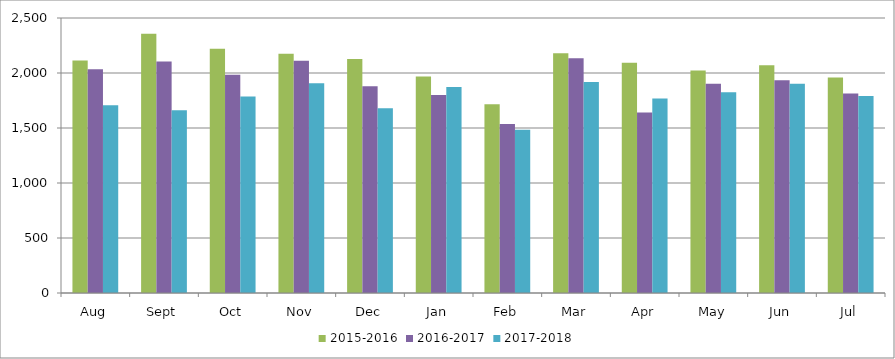
| Category | 2015-2016 | 2016-2017 | 2017-2018 |
|---|---|---|---|
| Aug | 2113 | 2034 | 1707 |
| Sept | 2356 | 2104 | 1662 |
| Oct | 2220 | 1984 | 1787 |
| Nov | 2175 | 2112 | 1907 |
| Dec | 2128 | 1879 | 1680 |
| Jan | 1969 | 1800 | 1872 |
| Feb | 1715 | 1537 | 1484 |
| Mar | 2180 | 2134 | 1918 |
| Apr | 2093 | 1640 | 1769 |
| May | 2022 | 1903 | 1825 |
| Jun | 2071 | 1934 | 1902 |
| Jul | 1960 | 1813 | 1790 |